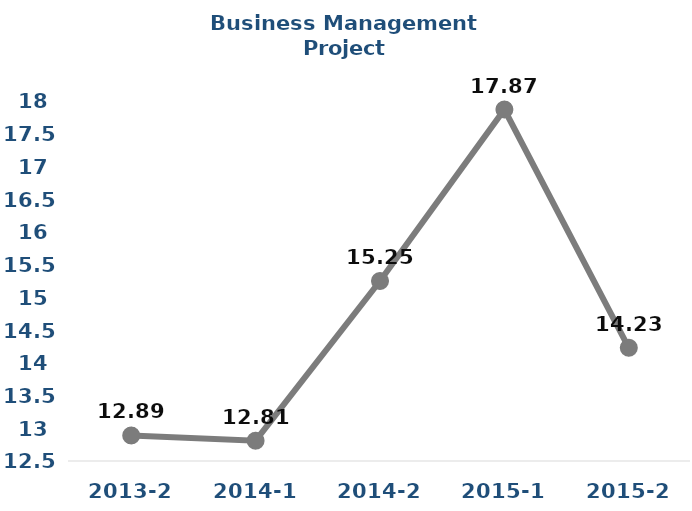
| Category | Series 0 |
|---|---|
| 2013-2 | 12.89 |
| 2014-1 | 12.81 |
| 2014-2 | 15.25 |
| 2015-1 | 17.87 |
| 2015-2 | 14.23 |